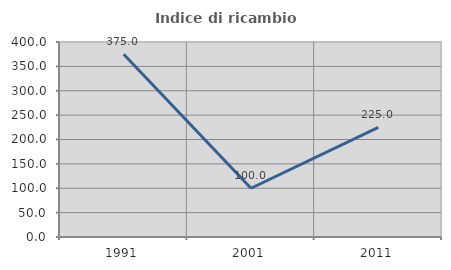
| Category | Indice di ricambio occupazionale  |
|---|---|
| 1991.0 | 375 |
| 2001.0 | 100 |
| 2011.0 | 225 |